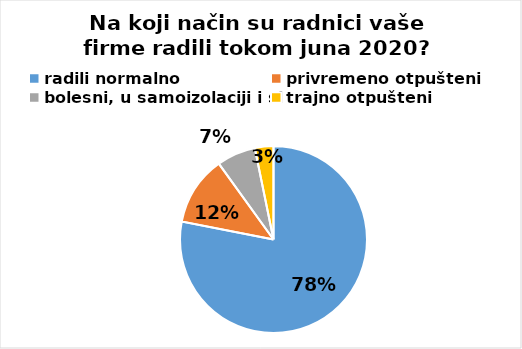
| Category | Series 0 |
|---|---|
| radili normalno | 267 |
| privremeno otpušteni | 41 |
| bolesni, u samoizolaciji i sl. | 23 |
| trajno otpušteni | 11 |